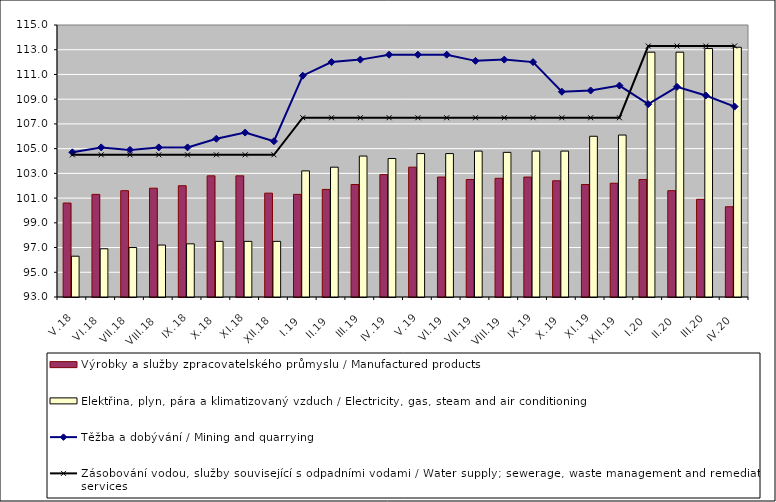
| Category | Výrobky a služby zpracovatelského průmyslu / Manufactured products | Elektřina, plyn, pára a klimatizovaný vzduch / Electricity, gas, steam and air conditioning |
|---|---|---|
| V.18 | 100.6 | 96.3 |
| VI.18 | 101.3 | 96.9 |
| VII.18 | 101.6 | 97 |
| VIII.18 | 101.8 | 97.2 |
| IX.18 | 102 | 97.3 |
| X.18 | 102.8 | 97.5 |
| XI.18 | 102.8 | 97.5 |
| XII.18 | 101.4 | 97.5 |
| I.19 | 101.3 | 103.2 |
| II.19 | 101.7 | 103.5 |
| III.19 | 102.1 | 104.4 |
| IV.19 | 102.9 | 104.2 |
| V.19 | 103.5 | 104.6 |
| VI.19 | 102.7 | 104.6 |
| VII.19 | 102.5 | 104.8 |
| VIII.19 | 102.6 | 104.7 |
| IX.19 | 102.7 | 104.8 |
| X.19 | 102.4 | 104.8 |
| XI.19 | 102.1 | 106 |
| XII.19 | 102.2 | 106.1 |
| I.20 | 102.5 | 112.8 |
| II.20 | 101.6 | 112.8 |
| III.20 | 100.9 | 113.1 |
| IV.20 | 100.3 | 113.2 |